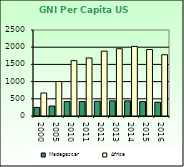
| Category | Madagascar | Africa                        |
|---|---|---|
| 2000.0 | 250 | 668.557 |
| 2005.0 | 290 | 1002.896 |
| 2010.0 | 420 | 1608.999 |
| 2011.0 | 420 | 1686.521 |
| 2012.0 | 430 | 1885.129 |
| 2013.0 | 440 | 1956.671 |
| 2014.0 | 440 | 2022.289 |
| 2015.0 | 420 | 1932.283 |
| 2016.0 | 400 | 1781.415 |